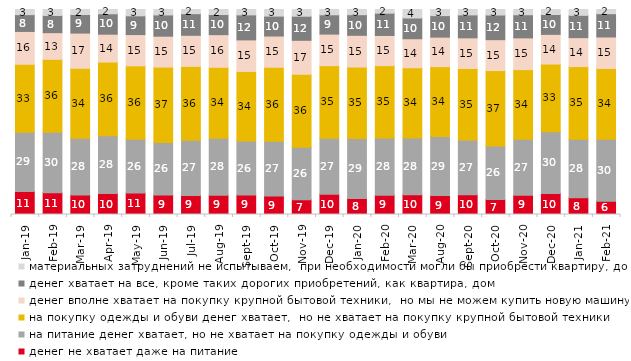
| Category | денег не хватает даже на питание | на питание денег хватает, но не хватает на покупку одежды и обуви | на покупку одежды и обуви денег хватает,  но не хватает на покупку крупной бытовой техники | денег вполне хватает на покупку крупной бытовой техники,  но мы не можем купить новую машину | денег хватает на все, кроме таких дорогих приобретений, как квартира, дом | материальных затруднений не испытываем,  при необходимости могли бы приобрести квартиру, дом |
|---|---|---|---|---|---|---|
| 2019-01-01 | 11.15 | 28.75 | 33.05 | 15.95 | 8.15 | 2.5 |
| 2019-02-01 | 10.6 | 29.5 | 35.55 | 13 | 8.4 | 2.9 |
| 2019-03-01 | 9.547 | 27.648 | 34.013 | 17.156 | 9.05 | 2.437 |
| 2019-04-01 | 10.198 | 28.119 | 35.891 | 13.564 | 9.95 | 2.079 |
| 2019-05-01 | 10.5 | 26.053 | 35.711 | 15.206 | 9.113 | 3.071 |
| 2019-06-01 | 9.426 | 25.536 | 36.658 | 15.012 | 10.324 | 2.643 |
| 2019-07-01 | 9.307 | 26.931 | 35.941 | 15.149 | 10.545 | 2.03 |
| 2019-08-01 | 9.391 | 27.722 | 34.466 | 15.884 | 9.79 | 2.448 |
| 2019-09-01 | 9.455 | 26.337 | 33.861 | 15.347 | 12.178 | 2.624 |
| 2019-10-01 | 9.059 | 26.584 | 36.04 | 15.198 | 9.703 | 3.218 |
| 2019-11-01 | 7.178 | 25.545 | 35.545 | 16.535 | 11.733 | 3.267 |
| 2019-12-01 | 9.851 | 27.327 | 35.297 | 15.396 | 9.406 | 2.574 |
| 2020-01-01 | 7.822 | 29.109 | 34.604 | 15.396 | 10 | 2.525 |
| 2020-02-01 | 9.406 | 27.772 | 35.198 | 14.653 | 10.842 | 1.782 |
| 2020-03-01 | 9.569 | 27.566 | 34.06 | 14.08 | 10.064 | 4.115 |
| 2020-08-01 | 9.235 | 28.699 | 34.012 | 14.35 | 10.477 | 2.979 |
| 2020-09-01 | 9.557 | 26.68 | 34.744 | 14.883 | 11.15 | 2.638 |
| 2020-10-01 | 7.275 | 26.109 | 36.721 | 15.047 | 12.008 | 2.691 |
| 2020-11-01 | 9.35 | 27.25 | 33.85 | 15.45 | 11.25 | 2.55 |
| 2020-12-01 | 10.213 | 29.995 | 32.97 | 14.427 | 9.668 | 2.429 |
| 2021-01-01 | 8.147 | 28.366 | 35.32 | 14.059 | 10.83 | 2.832 |
| 2021-02-01 | 6.452 | 29.975 | 34.293 | 15.236 | 11.266 | 2.035 |